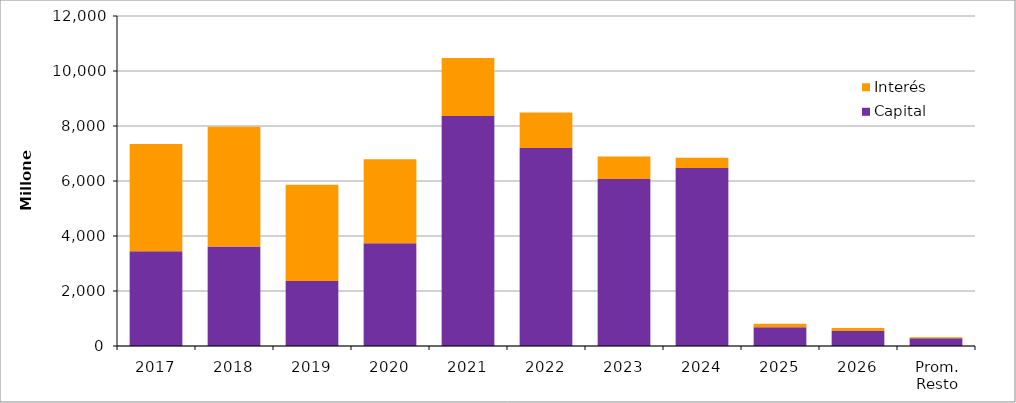
| Category | Capital | Interés |
|---|---|---|
| 2017 | 3445.986 | 3899.524 |
| 2018 | 3614.925 | 4354.004 |
| 2019 | 2360.2 | 3501.622 |
| 2020 | 3737.474 | 3056.321 |
| 2021 | 8360.776 | 2111.627 |
| 2022 | 7204.081 | 1284.259 |
| 2023 | 6073.855 | 820.166 |
| 2024 | 6471.7 | 369.827 |
| 2025 | 684.489 | 120.711 |
| 2026 | 544.183 | 113.25 |
| Prom. Resto | 277.565 | 38.374 |